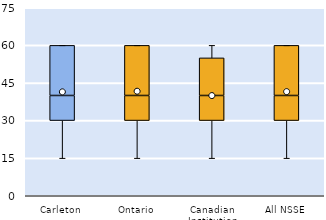
| Category | 25th | 50th | 75th |
|---|---|---|---|
| Carleton | 30 | 10 | 20 |
| Ontario | 30 | 10 | 20 |
| Canadian Institution | 30 | 10 | 15 |
| All NSSE | 30 | 10 | 20 |